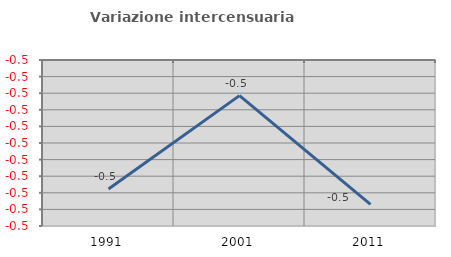
| Category | Variazione intercensuaria annua |
|---|---|
| 1991.0 | -0.49 |
| 2001.0 | -0.478 |
| 2011.0 | -0.491 |